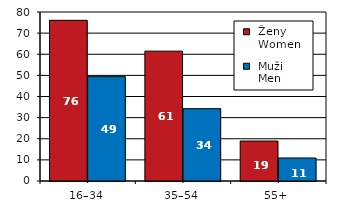
| Category |  Ženy 
 Women |  Muži 
 Men |
|---|---|---|
| 16–34 | 76.06 | 49.39 |
| 35–54 | 61.47 | 34.24 |
| 55+  | 18.92 | 10.89 |